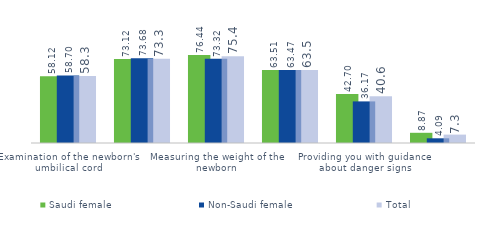
| Category | Saudi female  | Non-Saudi female | Total |
|---|---|---|---|
| Examination of the newborn's umbilical cord | 58.115 | 58.696 | 58.305 |
| Measuring the temperature of the newborn | 73.12 | 73.68 | 73.303 |
| Measuring the weight of the newborn | 76.436 | 73.316 | 75.417 |
| Providing you with guidance about breastfeeding | 63.509 | 63.466 | 63.495 |
| Providing you with guidance about danger signs | 42.699 | 36.172 | 40.568 |
| The baby did not undergo any tests | 8.874 | 4.089 | 7.311 |